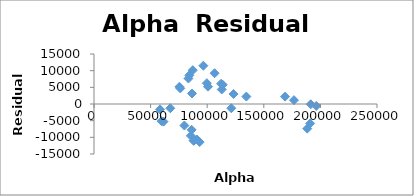
| Category | Series 0 |
|---|---|
| 93335.5 | -11418.01 |
| 85534.7 | -9536.46 |
| 87948.7 | -11017.755 |
| 90970.7 | -10655.074 |
| 88400.3 | -10991.195 |
| 86242.2 | -7757.04 |
| 79857.5 | -6465.289 |
| 61388.6 | -5289.885 |
| 59704.0 | -5150.015 |
| 58356.1 | -1612.791 |
| 67380.9 | -1278.322 |
| 76250.0 | 4684.979 |
| 75493.9 | 5162.389 |
| 86570.0 | 3143.241 |
| 84231.8 | 8613.115 |
| 96598.9 | 11483.971 |
| 121289.1 | -1272.284 |
| 112854.8 | 4353.215 |
| 123265.0 | 3005.836 |
| 99658.21 | 6240.869 |
| 100713.6 | 5196.017 |
| 83452.9 | 7653.864 |
| 87284.2 | 10145.509 |
| 106531.1 | 9235.651 |
| 112286.4 | 6077.56 |
| 113725.3 | 5770.921 |
| 134572.5 | 2228.455 |
| 168771.6 | 2204.389 |
| 176649.1 | 1147.621 |
| 196354.6 | -590.194 |
| 188372.3 | -7396.621 |
| 191449.8 | -80.364 |
| 190964.4 | -5836.302 |